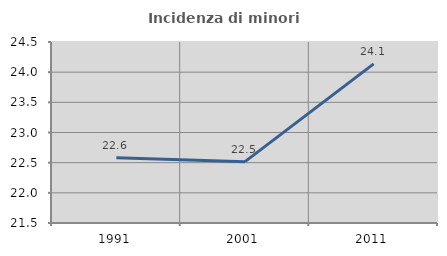
| Category | Incidenza di minori stranieri |
|---|---|
| 1991.0 | 22.581 |
| 2001.0 | 22.517 |
| 2011.0 | 24.138 |